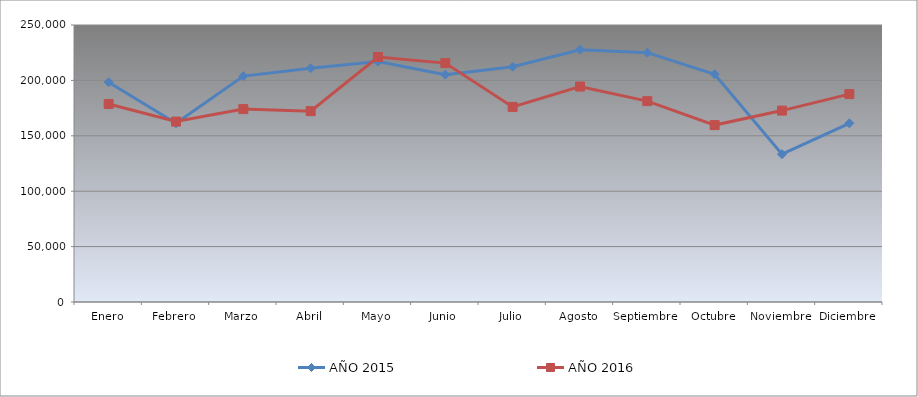
| Category | AÑO 2015 | AÑO 2016 |
|---|---|---|
| Enero | 198346.184 | 178741.991 |
| Febrero | 161300.155 | 162850.715 |
| Marzo | 203859.244 | 174124.311 |
| Abril | 211046.571 | 172248.351 |
| Mayo | 217066.107 | 221112.811 |
| Junio | 205184.918 | 215613.644 |
| Julio | 212367.86 | 176088.446 |
| Agosto | 227729.962 | 194449.456 |
| Septiembre | 225065.116 | 181298.224 |
| Octubre | 205497.652 | 159669.285 |
| Noviembre | 133389.123 | 172756.717 |
| Diciembre | 161280.499 | 187639.553 |